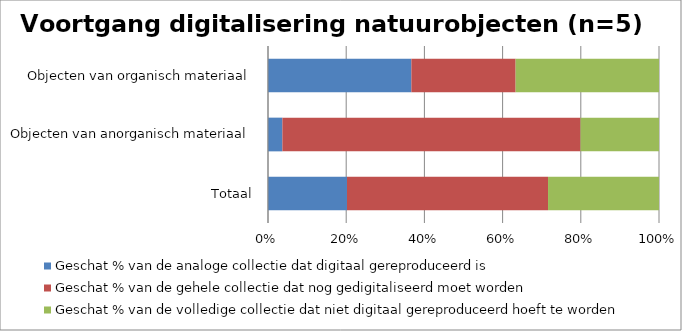
| Category | Geschat % van de analoge collectie dat digitaal gereproduceerd is  | Geschat % van de gehele collectie dat nog gedigitaliseerd moet worden | Geschat % van de volledige collectie dat niet digitaal gereproduceerd hoeft te worden |
|---|---|---|---|
| Totaal | 20.167 | 51.333 | 28.333 |
| Objecten van anorganisch materiaal | 3.667 | 76 | 20 |
| Objecten van organisch materiaal | 36.667 | 26.667 | 36.667 |